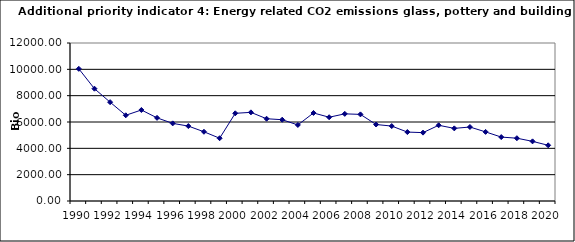
| Category | Energy related CO2 emissions glass, pottery and building materials, kt |
|---|---|
| 1990 | 10038.445 |
| 1991 | 8528.305 |
| 1992 | 7506.565 |
| 1993 | 6509.703 |
| 1994 | 6912.553 |
| 1995 | 6313.493 |
| 1996 | 5895.583 |
| 1997 | 5690.179 |
| 1998 | 5258.27 |
| 1999 | 4768.122 |
| 2000 | 6660.281 |
| 2001 | 6732.329 |
| 2002 | 6247.207 |
| 2003 | 6173.363 |
| 2004 | 5776.253 |
| 2005 | 6686.152 |
| 2006 | 6362.722 |
| 2007 | 6619.057 |
| 2008 | 6578.172 |
| 2009 | 5810.014 |
| 2010 | 5691.409 |
| 2011 | 5235.214 |
| 2012 | 5192.536 |
| 2013 | 5751.681 |
| 2014 | 5516.665 |
| 2015 | 5618.451 |
| 2016 | 5248.004 |
| 2017 | 4855.095 |
| 2018 | 4768.673 |
| 2019 | 4529.966 |
| 2020 | 4230.598 |